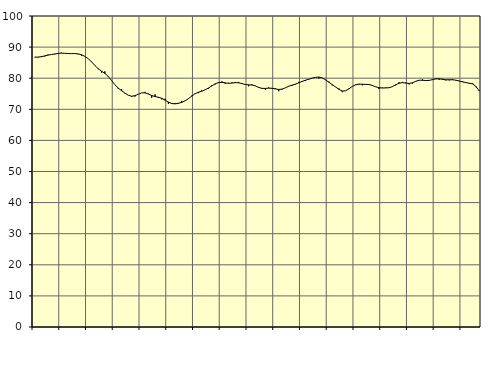
| Category | Piggar | Series 1 |
|---|---|---|
| nan | 86.7 | 86.77 |
| 87.0 | 86.7 | 86.78 |
| 87.0 | 87.1 | 86.91 |
| 87.0 | 87 | 87.17 |
| nan | 87.6 | 87.42 |
| 88.0 | 87.6 | 87.62 |
| 88.0 | 87.7 | 87.79 |
| 88.0 | 88.1 | 87.96 |
| nan | 88.2 | 88.06 |
| 89.0 | 88 | 88 |
| 89.0 | 87.9 | 87.92 |
| 89.0 | 87.9 | 87.91 |
| nan | 88 | 87.92 |
| 90.0 | 87.7 | 87.81 |
| 90.0 | 87.2 | 87.53 |
| 90.0 | 87.1 | 87.04 |
| nan | 86.3 | 86.29 |
| 91.0 | 85.4 | 85.28 |
| 91.0 | 84.2 | 84.11 |
| 91.0 | 83.2 | 83.04 |
| nan | 81.8 | 82.25 |
| 92.0 | 82.2 | 81.54 |
| 92.0 | 80.5 | 80.58 |
| 92.0 | 79.3 | 79.26 |
| nan | 77.9 | 77.9 |
| 93.0 | 76.6 | 76.83 |
| 93.0 | 76.5 | 75.97 |
| 93.0 | 75.1 | 75.21 |
| nan | 74.5 | 74.53 |
| 94.0 | 74 | 74.2 |
| 94.0 | 74.1 | 74.38 |
| 94.0 | 74.9 | 74.85 |
| nan | 75.3 | 75.29 |
| 95.0 | 75.6 | 75.3 |
| 95.0 | 75 | 74.89 |
| 95.0 | 73.7 | 74.44 |
| nan | 74.8 | 74.09 |
| 96.0 | 73.7 | 73.88 |
| 96.0 | 73.2 | 73.54 |
| 96.0 | 73.4 | 72.95 |
| nan | 71.7 | 72.32 |
| 97.0 | 72 | 71.85 |
| 97.0 | 72 | 71.75 |
| 97.0 | 71.8 | 71.94 |
| nan | 72.7 | 72.23 |
| 98.0 | 72.7 | 72.72 |
| 98.0 | 73.5 | 73.42 |
| 98.0 | 74.4 | 74.24 |
| nan | 75.1 | 75.01 |
| 99.0 | 75.2 | 75.5 |
| 99.0 | 76.1 | 75.84 |
| 99.0 | 76.2 | 76.26 |
| nan | 76.6 | 76.86 |
| 0.0 | 77.8 | 77.54 |
| 0.0 | 78 | 78.2 |
| 0.0 | 78.5 | 78.6 |
| nan | 79 | 78.66 |
| 1.0 | 78.2 | 78.5 |
| 1.0 | 78.5 | 78.36 |
| 1.0 | 78.6 | 78.44 |
| nan | 78.8 | 78.56 |
| 2.0 | 78.8 | 78.52 |
| 2.0 | 78.2 | 78.27 |
| 2.0 | 77.9 | 77.98 |
| nan | 77.4 | 77.86 |
| 3.0 | 78 | 77.81 |
| 3.0 | 77.6 | 77.53 |
| 3.0 | 76.9 | 77.03 |
| nan | 76.6 | 76.73 |
| 4.0 | 76.3 | 76.72 |
| 4.0 | 77 | 76.8 |
| 4.0 | 76.6 | 76.76 |
| nan | 76.8 | 76.56 |
| 5.0 | 75.8 | 76.38 |
| 5.0 | 76.3 | 76.48 |
| 5.0 | 76.9 | 76.92 |
| nan | 77.5 | 77.42 |
| 6.0 | 77.5 | 77.76 |
| 6.0 | 78 | 78.1 |
| 6.0 | 78.8 | 78.52 |
| nan | 78.8 | 78.96 |
| 7.0 | 79.1 | 79.35 |
| 7.0 | 79.6 | 79.68 |
| 7.0 | 80 | 80.02 |
| nan | 80.3 | 80.28 |
| 8.0 | 79.9 | 80.35 |
| 8.0 | 80.1 | 80.11 |
| 8.0 | 79.4 | 79.48 |
| nan | 78.9 | 78.7 |
| 9.0 | 77.7 | 77.92 |
| 9.0 | 77.2 | 77.18 |
| 9.0 | 76.7 | 76.42 |
| nan | 75.5 | 75.88 |
| 10.0 | 75.9 | 75.94 |
| 10.0 | 76.7 | 76.58 |
| 10.0 | 77.4 | 77.35 |
| nan | 78 | 77.88 |
| 11.0 | 78.2 | 78.07 |
| 11.0 | 77.7 | 78.06 |
| 11.0 | 78.1 | 78.01 |
| nan | 78 | 77.96 |
| 12.0 | 77.6 | 77.68 |
| 12.0 | 77.2 | 77.24 |
| 12.0 | 76.5 | 76.94 |
| nan | 77 | 76.84 |
| 13.0 | 77 | 76.87 |
| 13.0 | 76.9 | 76.94 |
| 13.0 | 77.3 | 77.29 |
| nan | 77.7 | 77.89 |
| 14.0 | 78.7 | 78.39 |
| 14.0 | 78.8 | 78.58 |
| 14.0 | 78.6 | 78.43 |
| nan | 78 | 78.32 |
| 15.0 | 78.3 | 78.53 |
| 15.0 | 79.1 | 79 |
| 15.0 | 79.3 | 79.35 |
| nan | 79.6 | 79.34 |
| 16.0 | 79.3 | 79.24 |
| 16.0 | 79.2 | 79.3 |
| 16.0 | 79.6 | 79.54 |
| nan | 80 | 79.78 |
| 17.0 | 79.5 | 79.81 |
| 17.0 | 79.8 | 79.63 |
| 17.0 | 79.3 | 79.48 |
| nan | 79.3 | 79.5 |
| 18.0 | 79.7 | 79.49 |
| 18.0 | 79.3 | 79.36 |
| 18.0 | 79 | 79.11 |
| nan | 79 | 78.81 |
| 19.0 | 78.6 | 78.6 |
| 19.0 | 78.2 | 78.38 |
| 19.0 | 78.4 | 78.18 |
| nan | 77.1 | 77.32 |
| 20.0 | 76 | 75.86 |